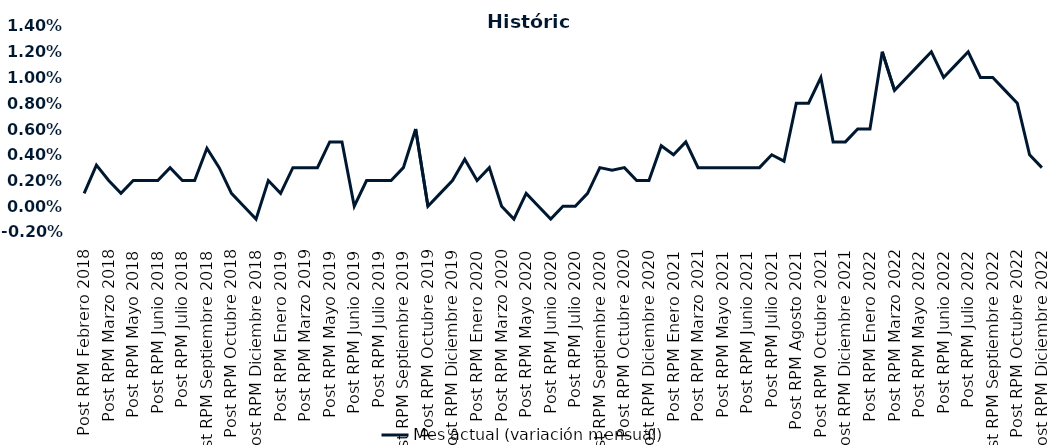
| Category | Mes actual (variación mensual)  |
|---|---|
| Post RPM Febrero 2018 | 0.001 |
| Pre RPM Marzo 2018 | 0.003 |
| Post RPM Marzo 2018 | 0.002 |
| Pre RPM Mayo 2018 | 0.001 |
| Post RPM Mayo 2018 | 0.002 |
| Pre RPM Junio 2018 | 0.002 |
| Post RPM Junio 2018 | 0.002 |
| Pre RPM Julio 2018 | 0.003 |
| Post RPM Julio 2018 | 0.002 |
| Pre RPM Septiembre 2018 | 0.002 |
| Post RPM Septiembre 2018 | 0.004 |
| Pre RPM Octubre 2018 | 0.003 |
| Post RPM Octubre 2018 | 0.001 |
| Pre RPM Diciembre 2018 | 0 |
| Post RPM Diciembre 2018 | -0.001 |
| Pre RPM Enero 2019 | 0.002 |
| Post RPM Enero 2019 | 0.001 |
| Pre RPM Marzo 2019 | 0.003 |
| Post RPM Marzo 2019 | 0.003 |
| Pre RPM Mayo 2019 | 0.003 |
| Post RPM Mayo 2019 | 0.005 |
| Pre RPM Junio 2019 | 0.005 |
| Post RPM Junio 2019 | 0 |
| Pre RPM Julio 2019 | 0.002 |
| Post RPM Julio 2019 | 0.002 |
| Pre RPM Septiembre 2019 | 0.002 |
| Post RPM Septiembre 2019 | 0.003 |
| Pre RPM Octubre 2019 | 0.006 |
| Post RPM Octubre 2019 | 0 |
| Pre RPM Diciembre 2019 | 0.001 |
| Post RPM Diciembre 2019 | 0.002 |
| Pre RPM Enero 2020 | 0.004 |
| Post RPM Enero 2020 | 0.002 |
| Pre RPM Marzo 2020 | 0.003 |
| Post RPM Marzo 2020 | 0 |
| Pre RPM Mayo 2020 | -0.001 |
| Post RPM Mayo 2020 | 0.001 |
| Pre RPM Junio 2020 | 0 |
| Post RPM Junio 2020 | -0.001 |
| Pre RPM Julio 2020 | 0 |
| Post RPM Julio 2020 | 0 |
| Pre RPM Septiembre 2020 | 0.001 |
| Post RPM Septiembre 2020 | 0.003 |
| Pre RPM Octubre 2020 | 0.003 |
| Post RPM Octubre 2020 | 0.003 |
| Pre RPM Diciembre 2020 | 0.002 |
| Post RPM Diciembre 2020 | 0.002 |
| Pre RPM Enero 2021 | 0.005 |
| Post RPM Enero 2021 | 0.004 |
| Pre RPM Marzo 2021 | 0.005 |
| Post RPM Marzo 2021 | 0.003 |
| Pre RPM Mayo 2021 | 0.003 |
| Post RPM Mayo 2021 | 0.003 |
| Pre RPM Junio 2021 | 0.003 |
| Post RPM Junio 2021 | 0.003 |
| Pre RPM Julio 2021 | 0.003 |
| Post RPM Julio 2021 | 0.004 |
| Pre RPM Agosto 2021 | 0.004 |
| Post RPM Agosto 2021 | 0.008 |
| Pre RPM Octubre 2021 | 0.008 |
| Post RPM Octubre 2021 | 0.01 |
| Pre RPM Diciembre 2021 | 0.005 |
| Post RPM Diciembre 2021 | 0.005 |
| Pre RPM Enero 2022 | 0.006 |
| Post RPM Enero 2022 | 0.006 |
| Pre RPM Marzo 2022 | 0.012 |
| Post RPM Marzo 2022 | 0.009 |
| Pre RPM Mayo 2022 | 0.01 |
| Post RPM Mayo 2022 | 0.011 |
| Pre RPM Junio 2022 | 0.012 |
| Post RPM Junio 2022 | 0.01 |
| Pre RPM Julio 2022 | 0.011 |
| Post RPM Julio 2022 | 0.012 |
| Pre RPM Septiembre 2022 | 0.01 |
| Post RPM Septiembre 2022 | 0.01 |
| Pre RPM Octubre 2022 | 0.009 |
| Post RPM Octubre 2022 | 0.008 |
| Pre RPM Diciembre 2022 | 0.004 |
| Post RPM Diciembre 2022 | 0.003 |